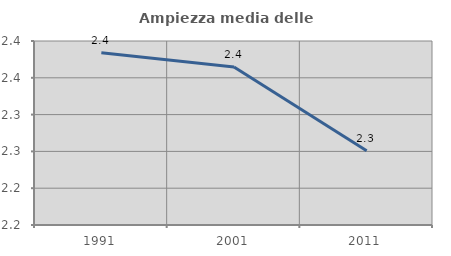
| Category | Ampiezza media delle famiglie |
|---|---|
| 1991.0 | 2.384 |
| 2001.0 | 2.365 |
| 2011.0 | 2.251 |